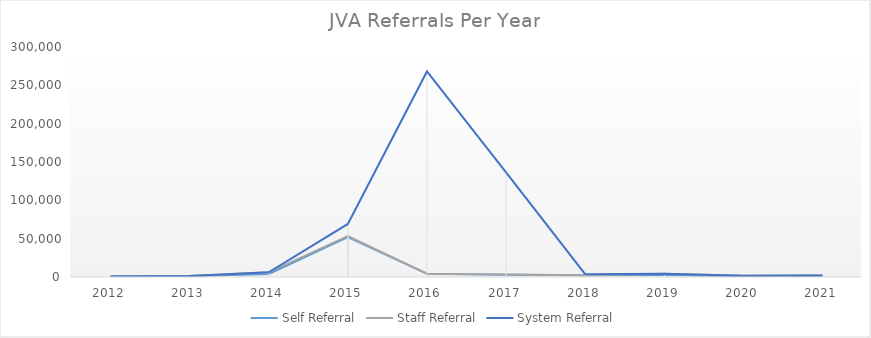
| Category | Self Referral | Staff Referral | System Referral |
|---|---|---|---|
| 2012.0 | 645 | 41 | 0 |
| 2013.0 | 1194 | 195 | 0 |
| 2014.0 | 3885 | 2238 | 0 |
| 2015.0 | 51921 | 1422 | 15887 |
| 2016.0 | 4338 | 0 | 263784 |
| 2017.0 | 2851 | 534 | 133106 |
| 2018.0 | 2426 | 0 | 1289 |
| 2019.0 | 2596 | 1653 | 0 |
| 2020.0 | 1181 | 416 | 0 |
| 2021.0 | 1650 | 252 | 0 |